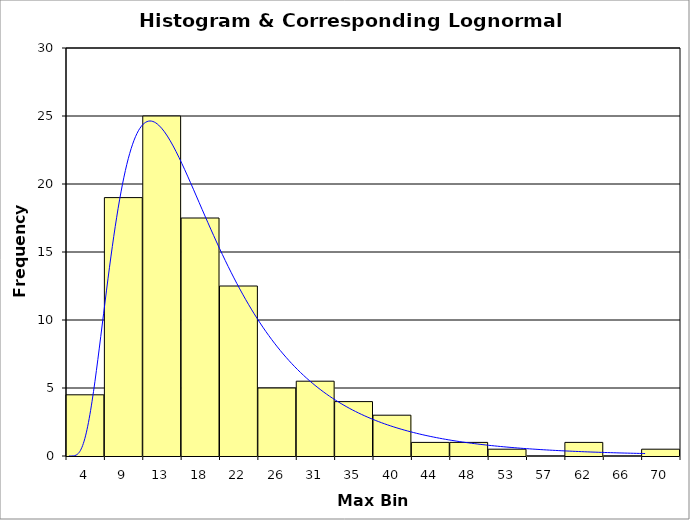
| Category | Series 0 | Series 1 | HistBars |
|---|---|---|---|
| 4.0 |  |  | 4.5 |
| 9.0 |  |  | 19 |
| 13.0 |  |  | 25 |
| 18.0 |  |  | 17.5 |
| 22.0 |  |  | 12.5 |
| 26.0 |  |  | 5 |
| 31.0 |  |  | 5.5 |
| 35.0 |  |  | 4 |
| 40.0 |  |  | 3 |
| 44.0 |  |  | 1 |
| 48.0 |  |  | 1 |
| 53.0 |  |  | 0.5 |
| 57.0 |  |  | 0 |
| 62.0 |  |  | 1 |
| 66.0 |  |  | 0 |
| 70.0 |  |  | 0.5 |